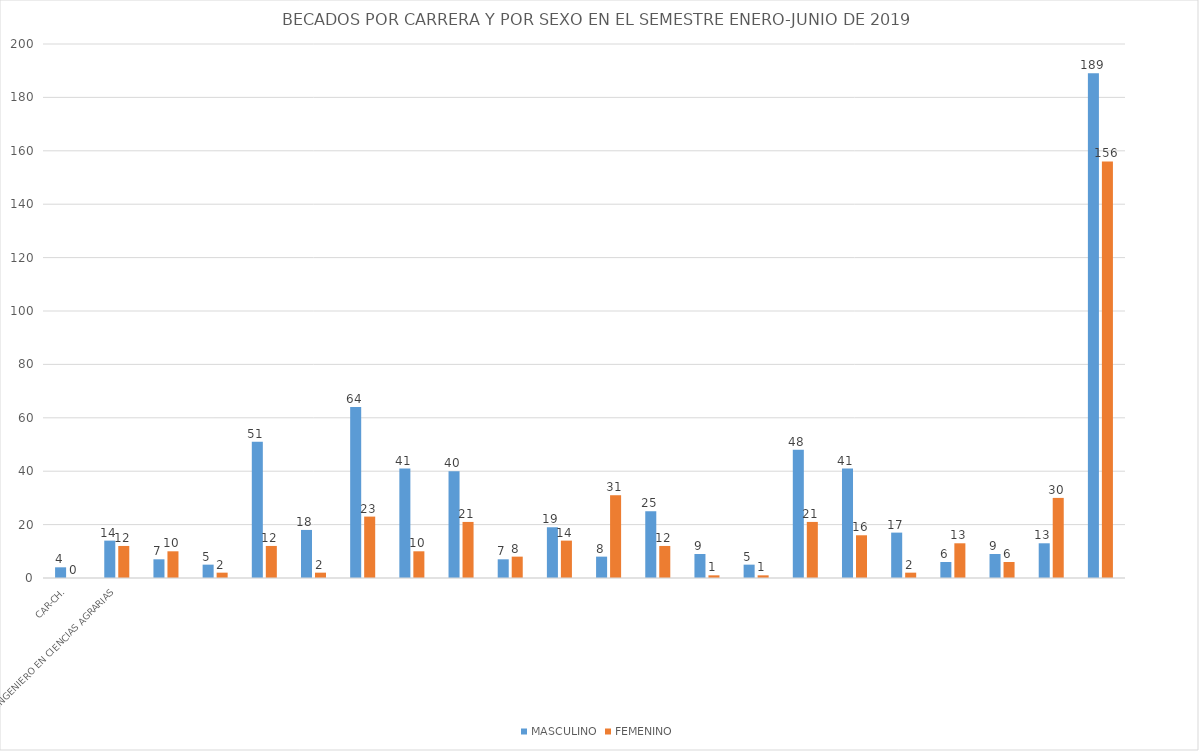
| Category | MASCULINO | FEMENINO |
|---|---|---|
| 0 | 4 | 0 |
| 1 | 14 | 12 |
| 2 | 7 | 10 |
| 3 | 5 | 2 |
| 4 | 51 | 12 |
| 5 | 18 | 2 |
| 6 | 64 | 23 |
| 7 | 41 | 10 |
| 8 | 40 | 21 |
| 9 | 7 | 8 |
| 10 | 19 | 14 |
| 11 | 8 | 31 |
| 12 | 25 | 12 |
| 13 | 9 | 1 |
| 14 | 5 | 1 |
| 15 | 48 | 21 |
| 16 | 41 | 16 |
| 17 | 17 | 2 |
| 18 | 6 | 13 |
| 19 | 9 | 6 |
| 20 | 13 | 30 |
| 21 | 189 | 156 |